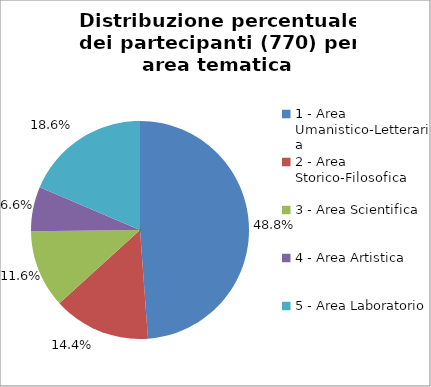
| Category | Nr. Partecipanti |
|---|---|
| 1 - Area Umanistico-Letteraria | 376 |
| 2 - Area Storico-Filosofica | 111 |
| 3 - Area Scientifica | 89 |
| 4 - Area Artistica | 51 |
| 5 - Area Laboratorio | 143 |